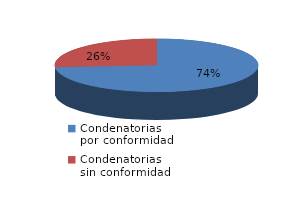
| Category | Series 0 |
|---|---|
| 0 | 417 |
| 1 | 148 |